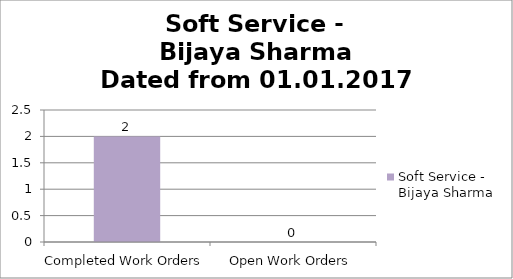
| Category | Soft Service - Bijaya Sharma |
|---|---|
| Completed Work Orders | 2 |
| Open Work Orders | 0 |